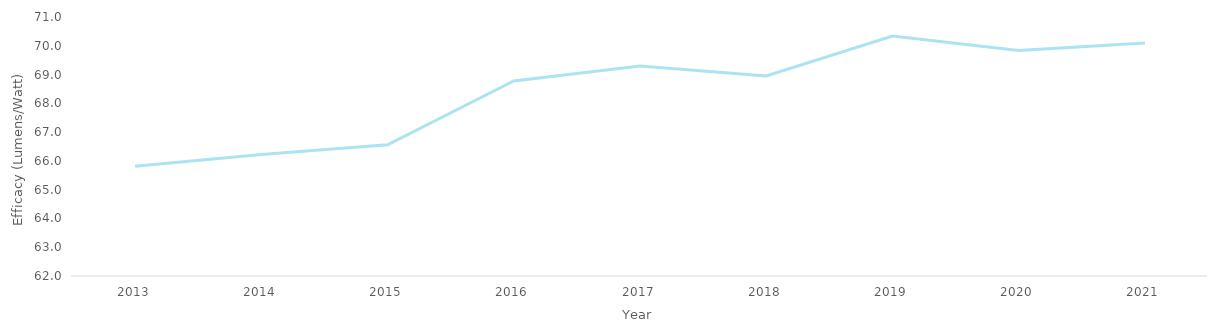
| Category | Lumens per Watt |
|---|---|
| 2013.0 | 65.812 |
| 2014.0 | 66.223 |
| 2015.0 | 66.562 |
| 2016.0 | 68.78 |
| 2017.0 | 69.3 |
| 2018.0 | 68.949 |
| 2019.0 | 70.338 |
| 2020.0 | 69.837 |
| 2021.0 | 70.1 |